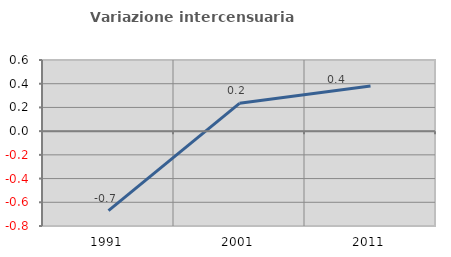
| Category | Variazione intercensuaria annua |
|---|---|
| 1991.0 | -0.671 |
| 2001.0 | 0.234 |
| 2011.0 | 0.38 |